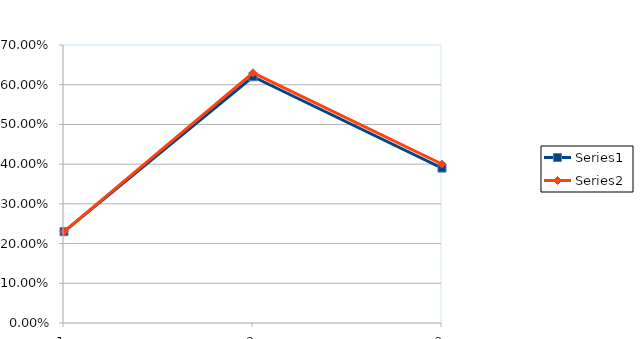
| Category | Series 0 | Series 1 |
|---|---|---|
| 0 | 0.23 | 0.23 |
| 1 | 0.62 | 0.63 |
| 2 | 0.39 | 0.4 |